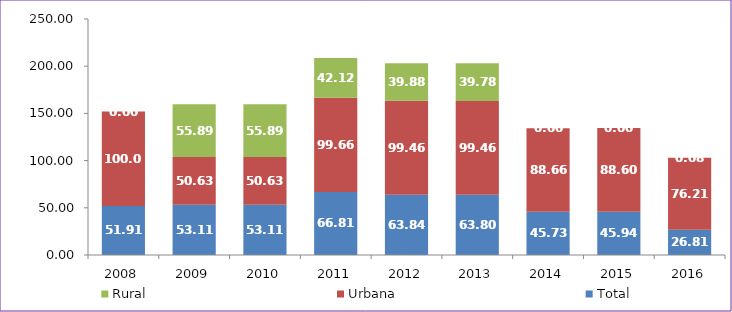
| Category | Total | Urbana | Rural |
|---|---|---|---|
| 2008.0 | 51.91 | 100 | 0 |
| 2009.0 | 53.11 | 50.63 | 55.89 |
| 2010.0 | 53.11 | 50.63 | 55.89 |
| 2011.0 | 66.81 | 99.66 | 42.12 |
| 2012.0 | 63.84 | 99.46 | 39.88 |
| 2013.0 | 63.8 | 99.46 | 39.78 |
| 2014.0 | 45.73 | 88.66 | 0 |
| 2015.0 | 45.94 | 88.6 | 0 |
| 2016.0 | 26.81 | 76.21 | 0.08 |